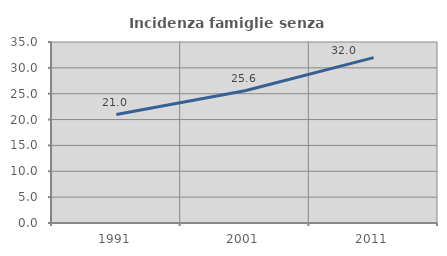
| Category | Incidenza famiglie senza nuclei |
|---|---|
| 1991.0 | 20.967 |
| 2001.0 | 25.581 |
| 2011.0 | 31.971 |